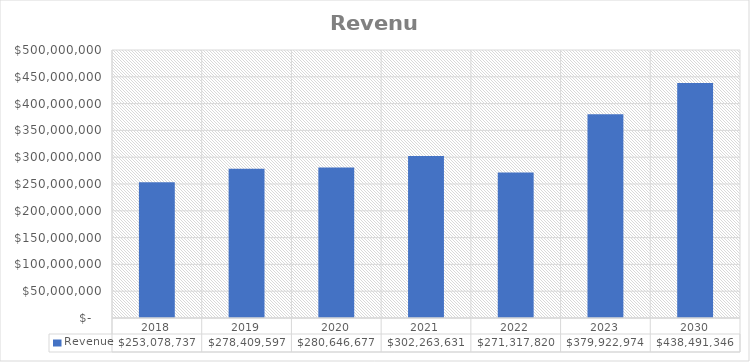
| Category | Revenue |
|---|---|
| 2018.0 | 253078737 |
| 2019.0 | 278409597 |
| 2020.0 | 280646677 |
| 2021.0 | 302263631 |
| 2022.0 | 271317820 |
| 2023.0 | 379922974 |
| 2030.0 | 438491346.224 |